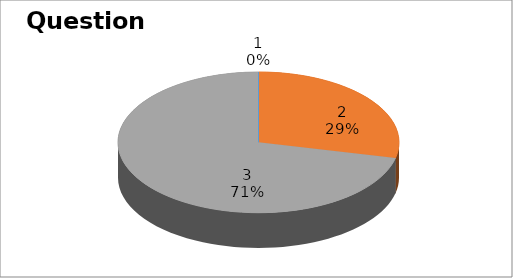
| Category | Series 0 |
|---|---|
| 0 | 0 |
| 1 | 6 |
| 2 | 15 |